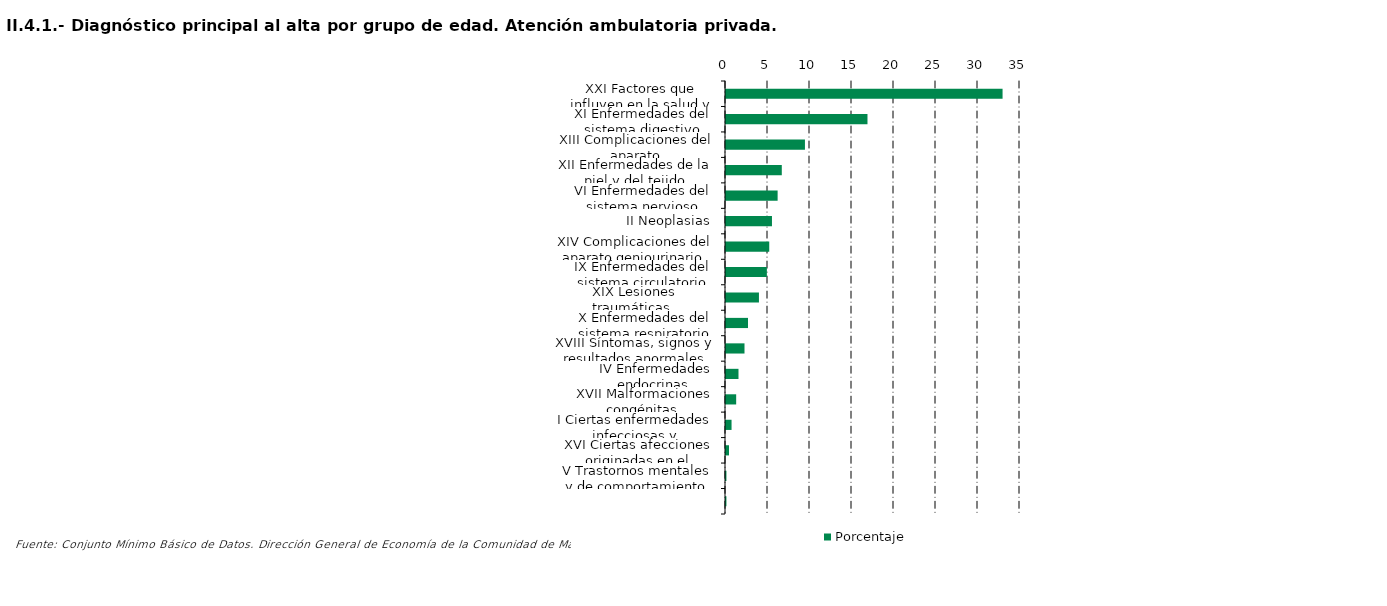
| Category | Porcentaje |
|---|---|
| XXI Factores que influyen en la salud y contacto con los servicios sanitarios | 32.924 |
| XI Enfermedades del sistema digestivo | 16.843 |
| XIII Complicaciones del aparato musculoesquelético y del tejido conectivo | 9.398 |
| XII Enfermedades de la piel y del tejido subcutáneo | 6.642 |
| VI Enfermedades del sistema nervioso | 6.146 |
| II Neoplasias | 5.472 |
| XIV Complicaciones del aparato geniourinario | 5.149 |
| IX Enfermedades del sistema circulatorio | 4.865 |
| XIX Lesiones traumáticas, envenenamientos y otras consecuencias de causas externas | 3.922 |
| X Enfermedades del sistema respiratorio | 2.62 |
| XVIII Síntomas, signos y resultados anormales de pruebas complementarias, no clasificados bajo otro concepto | 2.202 |
| IV Enfermedades endocrinas, nutricionales y metabólicas | 1.487 |
| XVII Malformaciones congénitas, deformidades y anomalías cromosómicas | 1.211 |
| I Ciertas enfermedades infecciosas y parasitarias | 0.66 |
| XVI Ciertas afecciones originadas en el periodo perinatal | 0.356 |
| V Trastornos mentales y de comportamiento | 0.05 |